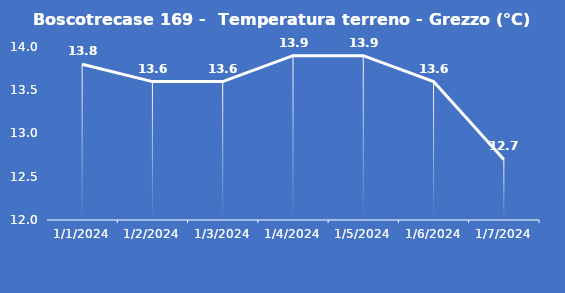
| Category | Boscotrecase 169 -  Temperatura terreno - Grezzo (°C) |
|---|---|
| 1/1/24 | 13.8 |
| 1/2/24 | 13.6 |
| 1/3/24 | 13.6 |
| 1/4/24 | 13.9 |
| 1/5/24 | 13.9 |
| 1/6/24 | 13.6 |
| 1/7/24 | 12.7 |